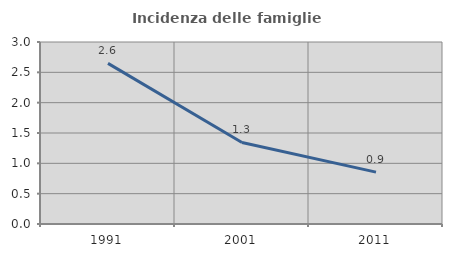
| Category | Incidenza delle famiglie numerose |
|---|---|
| 1991.0 | 2.648 |
| 2001.0 | 1.344 |
| 2011.0 | 0.855 |